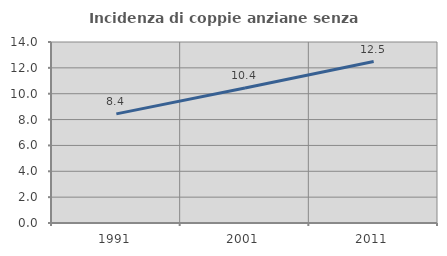
| Category | Incidenza di coppie anziane senza figli  |
|---|---|
| 1991.0 | 8.439 |
| 2001.0 | 10.439 |
| 2011.0 | 12.487 |